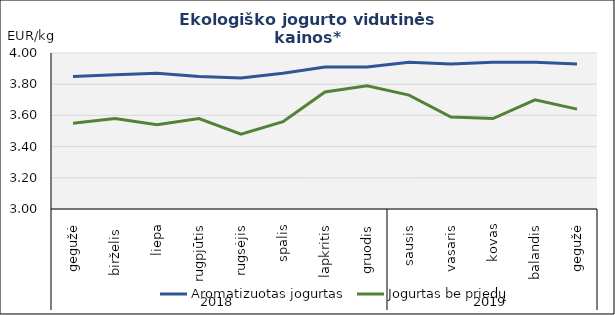
| Category | Aromatizuotas jogurtas | Jogurtas be priedų |
|---|---|---|
| 0 | 3.85 | 3.55 |
| 1 | 3.86 | 3.58 |
| 2 | 3.87 | 3.54 |
| 3 | 3.85 | 3.58 |
| 4 | 3.84 | 3.48 |
| 5 | 3.87 | 3.56 |
| 6 | 3.91 | 3.75 |
| 7 | 3.91 | 3.79 |
| 8 | 3.94 | 3.73 |
| 9 | 3.93 | 3.59 |
| 10 | 3.94 | 3.58 |
| 11 | 3.94 | 3.7 |
| 12 | 3.93 | 3.64 |